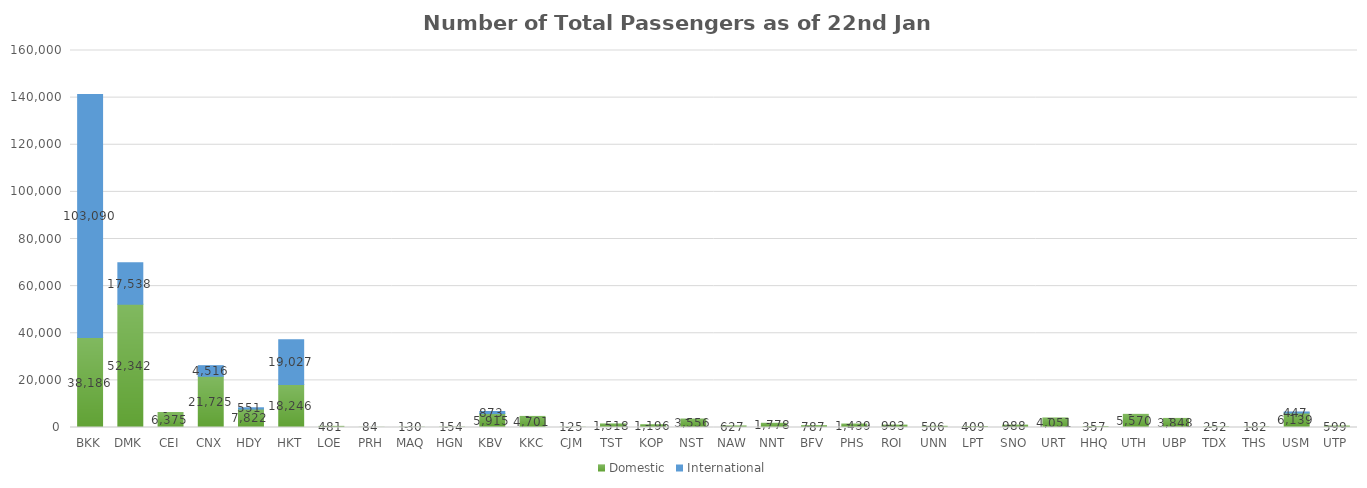
| Category | Domestic | International |
|---|---|---|
| BKK | 38186 | 103090 |
| DMK | 52342 | 17538 |
| CEI | 6375 | 0 |
| CNX | 21725 | 4516 |
| HDY | 7822 | 551 |
| HKT | 18246 | 19027 |
| LOE | 481 | 0 |
| PRH | 84 | 0 |
| MAQ | 130 | 0 |
| HGN | 154 | 0 |
| KBV | 5915 | 873 |
| KKC | 4701 | 0 |
| CJM | 125 | 0 |
| TST | 1518 | 0 |
| KOP | 1196 | 0 |
| NST | 3556 | 0 |
| NAW | 627 | 0 |
| NNT | 1778 | 0 |
| BFV | 787 | 0 |
| PHS | 1439 | 0 |
| ROI | 993 | 0 |
| UNN | 506 | 0 |
| LPT | 409 | 0 |
| SNO | 988 | 0 |
| URT | 4051 | 0 |
| HHQ | 357 | 0 |
| UTH | 5570 | 0 |
| UBP | 3848 | 0 |
| TDX | 252 | 0 |
| THS | 182 | 0 |
| USM | 6139 | 447 |
| UTP | 599 | 0 |